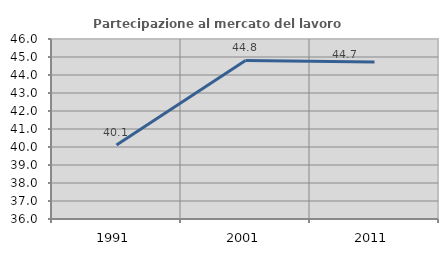
| Category | Partecipazione al mercato del lavoro  femminile |
|---|---|
| 1991.0 | 40.115 |
| 2001.0 | 44.807 |
| 2011.0 | 44.727 |